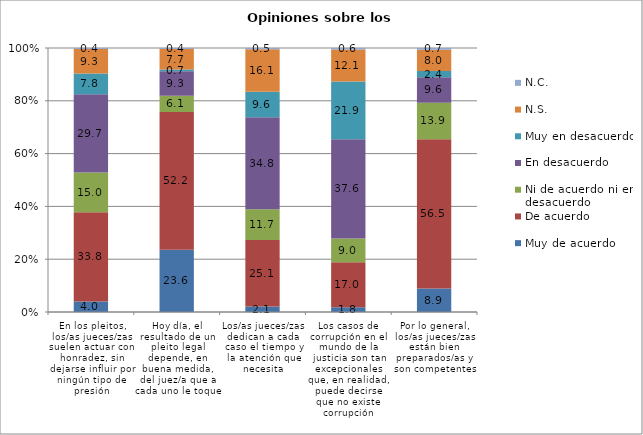
| Category | Muy de acuerdo | De acuerdo | Ni de acuerdo ni en desacuerdo | En desacuerdo | Muy en desacuerdo | N.S.  | N.C.  |
|---|---|---|---|---|---|---|---|
| En los pleitos, los/as jueces/zas suelen actuar con honradez, sin dejarse influir por ningún tipo de presión | 4 | 33.8 | 15 | 29.7 | 7.8 | 9.3 | 0.4 |
| Hoy día, el resultado de un pleito legal depende, en buena medida, del juez/a que a cada uno le toque | 23.6 | 52.2 | 6.1 | 9.3 | 0.7 | 7.7 | 0.4 |
| Los/as jueces/zas dedican a cada caso el tiempo y la atención que necesita | 2.1 | 25.1 | 11.7 | 34.8 | 9.6 | 16.1 | 0.5 |
| Los casos de corrupción en el mundo de la justicia son tan excepcionales que, en realidad, puede decirse que no existe corrupción | 1.8 | 17 | 9 | 37.6 | 21.9 | 12.1 | 0.6 |
| Por lo general, los/as jueces/zas están bien preparados/as y son competentes | 8.9 | 56.5 | 13.9 | 9.6 | 2.4 | 8 | 0.7 |